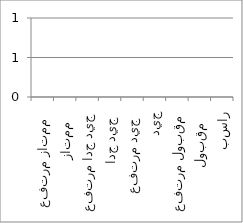
| Category | Series 0 |
|---|---|
| ممتاز مرتفع  | 0 |
| ممتاز   | 0 |
| جيد جدا مرتفع | 0 |
| جيد جدا  | 0 |
| جيد مرتفع  | 0 |
| جيد | 0 |
| مقبول مرتفع | 0 |
| مقبول   | 0 |
| راسب | 0 |